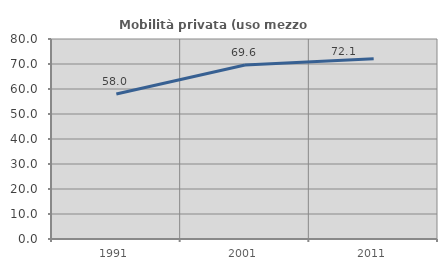
| Category | Mobilità privata (uso mezzo privato) |
|---|---|
| 1991.0 | 58.009 |
| 2001.0 | 69.588 |
| 2011.0 | 72.129 |